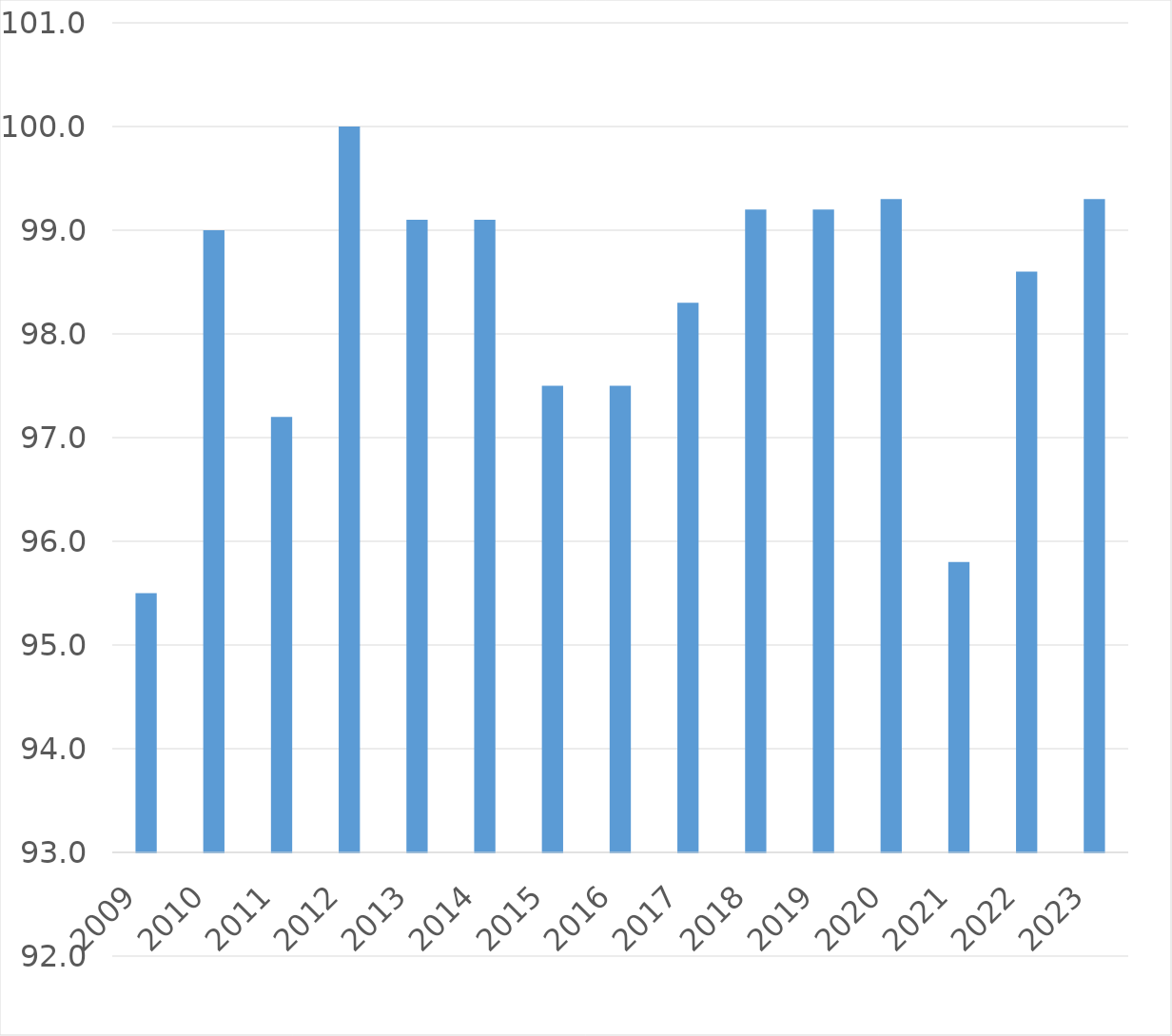
| Category | Series 0 |
|---|---|
| 2009 | 95.5 |
| 2010 | 99 |
| 2011 | 97.2 |
| 2012 | 100 |
| 2013 | 99.1 |
| 2014 | 99.1 |
| 2015 | 97.5 |
| 2016 | 97.5 |
| 2017 | 98.3 |
| 2018 | 99.2 |
| 2019 | 99.2 |
| 2020 | 99.3 |
| 2021 | 95.8 |
| 2022 | 98.6 |
| 2023 | 99.3 |